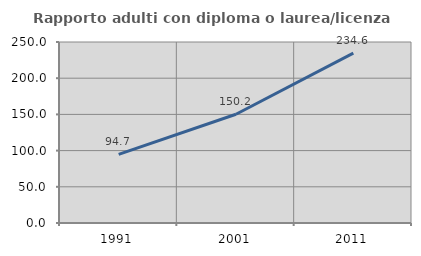
| Category | Rapporto adulti con diploma o laurea/licenza media  |
|---|---|
| 1991.0 | 94.737 |
| 2001.0 | 150.215 |
| 2011.0 | 234.637 |